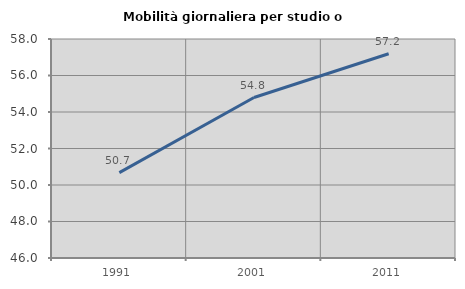
| Category | Mobilità giornaliera per studio o lavoro |
|---|---|
| 1991.0 | 50.681 |
| 2001.0 | 54.795 |
| 2011.0 | 57.19 |